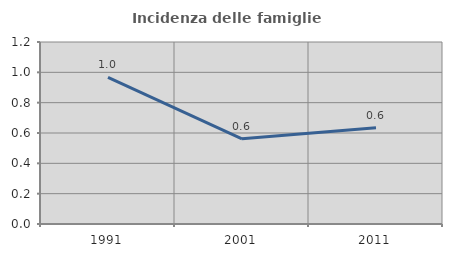
| Category | Incidenza delle famiglie numerose |
|---|---|
| 1991.0 | 0.966 |
| 2001.0 | 0.562 |
| 2011.0 | 0.635 |